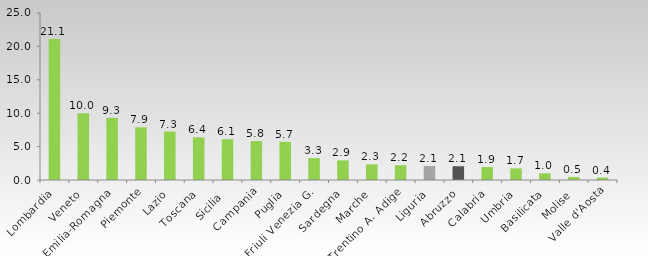
| Category | Series 0 |
|---|---|
| Lombardia | 21.124 |
| Veneto | 10.004 |
| Emilia-Romagna | 9.3 |
| Piemonte | 7.884 |
| Lazio | 7.255 |
| Toscana | 6.38 |
| Sicilia  | 6.11 |
| Campania | 5.832 |
| Puglia | 5.714 |
| Friuli Venezia G. | 3.27 |
| Sardegna | 2.937 |
| Marche | 2.331 |
| Trentino A. Adige | 2.21 |
| Liguria | 2.1 |
| Abruzzo | 2.061 |
| Calabria | 1.931 |
| Umbria | 1.732 |
| Basilicata | 1.002 |
| Molise | 0.458 |
| Valle d'Aosta | 0.366 |